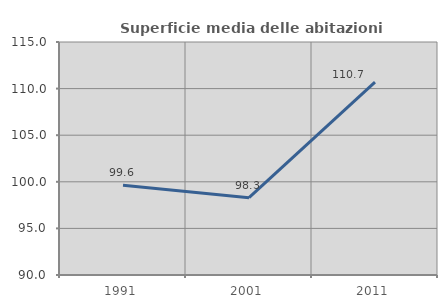
| Category | Superficie media delle abitazioni occupate |
|---|---|
| 1991.0 | 99.633 |
| 2001.0 | 98.291 |
| 2011.0 | 110.683 |